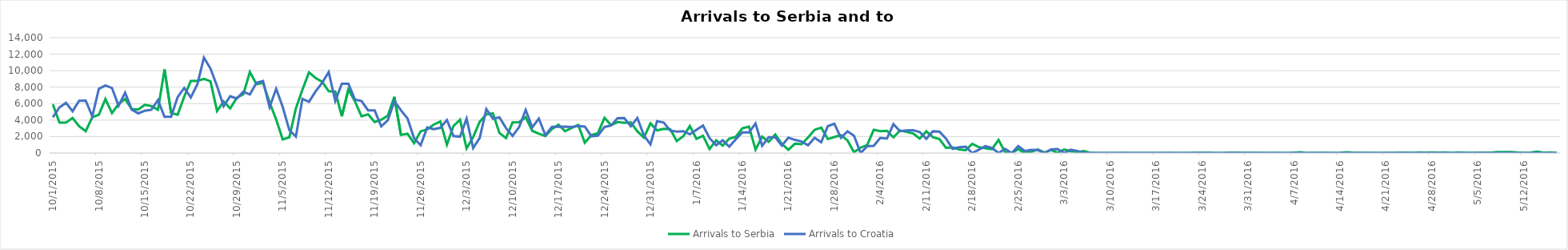
| Category | Arrivals to Serbia | Arrivals to Croatia |
|---|---|---|
| 10/1/15 | 5900 | 4344 |
| 10/2/15 | 3700 | 5546 |
| 10/3/15 | 3700 | 6086 |
| 10/4/15 | 4250 | 5065 |
| 10/5/15 | 3250 | 6338 |
| 10/6/15 | 2650 | 6370 |
| 10/7/15 | 4350 | 4446 |
| 10/8/15 | 4650 | 7798 |
| 10/9/15 | 6550 | 8201 |
| 10/10/15 | 4850 | 7896 |
| 10/11/15 | 5950 | 5732 |
| 10/12/15 | 6556 | 7317 |
| 10/13/15 | 5330 | 5286 |
| 10/14/15 | 5280 | 4814 |
| 10/15/15 | 5850 | 5138 |
| 10/16/15 | 5700 | 5260 |
| 10/17/15 | 5250 | 6415 |
| 10/18/15 | 10150 | 4390 |
| 10/19/15 | 4850 | 4388 |
| 10/20/15 | 4650 | 6793 |
| 10/21/15 | 6850 | 7900 |
| 10/22/15 | 8750 | 6748 |
| 10/23/15 | 8750 | 8348 |
| 10/24/15 | 9000 | 11570 |
| 10/25/15 | 8700 | 10249 |
| 10/26/15 | 5100 | 8128 |
| 10/27/15 | 6257 | 5683 |
| 10/28/15 | 5415 | 6900 |
| 10/29/15 | 6700 | 6615 |
| 10/30/15 | 7138 | 7429 |
| 10/31/15 | 9834 | 7110 |
| 11/1/15 | 8354 | 8534 |
| 11/2/15 | 8521 | 8746 |
| 11/3/15 | 6129 | 5573 |
| 11/4/15 | 4073 | 7792 |
| 11/5/15 | 1652 | 5587 |
| 11/6/15 | 1906 | 2809 |
| 11/7/15 | 5397 | 2000 |
| 11/8/15 | 7695 | 6579 |
| 11/9/15 | 9785 | 6214 |
| 11/10/15 | 9107 | 7474 |
| 11/11/15 | 8648 | 8524 |
| 11/12/15 | 7500 | 9823 |
| 11/13/15 | 7464 | 6314 |
| 11/14/15 | 4453 | 8405 |
| 11/15/15 | 7734 | 8415 |
| 11/16/15 | 6267 | 6490 |
| 11/17/15 | 4460 | 6304 |
| 11/18/15 | 4694 | 5180 |
| 11/19/15 | 3765 | 5167 |
| 11/20/15 | 4042 | 3230 |
| 11/21/15 | 4527 | 3977 |
| 11/22/15 | 6826 | 6305 |
| 11/23/15 | 2201 | 5184 |
| 11/24/15 | 2335 | 4203 |
| 11/25/15 | 1194 | 1808 |
| 11/26/15 | 2636 | 952 |
| 11/27/15 | 2878 | 3095 |
| 11/28/15 | 3454 | 2886 |
| 11/29/15 | 3825 | 3060 |
| 11/30/15 | 1009 | 4009 |
| 12/1/15 | 3284 | 2066 |
| 12/2/15 | 4040 | 1982 |
| 12/3/15 | 553 | 4174 |
| 12/4/15 | 1927 | 611 |
| 12/5/15 | 3799 | 1835 |
| 12/6/15 | 4686 | 5339 |
| 12/7/15 | 4823 | 4162 |
| 12/8/15 | 2437 | 4335 |
| 12/9/15 | 1807 | 3027 |
| 12/10/15 | 3723 | 2076 |
| 12/11/15 | 3747 | 3149 |
| 12/12/15 | 4339 | 5225 |
| 12/13/15 | 2698 | 3112 |
| 12/14/15 | 2353 | 4174 |
| 12/15/15 | 2067 | 2160 |
| 12/16/15 | 2916 | 3177 |
| 12/17/15 | 3438 | 3192 |
| 12/18/15 | 2649 | 3200 |
| 12/19/15 | 3052 | 3156 |
| 12/20/15 | 3405 | 3276 |
| 12/21/15 | 1253 | 3210 |
| 12/22/15 | 2186 | 2027 |
| 12/23/15 | 2415 | 2116 |
| 12/24/15 | 4279 | 3166 |
| 12/25/15 | 3390 | 3339 |
| 12/26/15 | 3757 | 4241 |
| 12/27/15 | 3674 | 4251 |
| 12/28/15 | 3708 | 3249 |
| 12/29/15 | 2629 | 4253 |
| 12/30/15 | 1879 | 2132 |
| 12/31/15 | 3602 | 1058 |
| 1/1/16 | 2745 | 3869 |
| 1/2/16 | 2947 | 3710 |
| 1/3/16 | 2889 | 2732 |
| 1/4/16 | 1462 | 2591 |
| 1/5/16 | 2041 | 2650 |
| 1/6/16 | 3273 | 2273 |
| 1/7/16 | 1715 | 2814 |
| 1/8/16 | 2100 | 3332 |
| 1/9/16 | 489 | 1799 |
| 1/10/16 | 1538 | 942 |
| 1/11/16 | 905 | 1549 |
| 1/12/16 | 1743 | 769 |
| 1/13/16 | 1973 | 1679 |
| 1/14/16 | 3006 | 2502 |
| 1/15/16 | 3213 | 2493 |
| 1/16/16 | 415 | 3579 |
| 1/17/16 | 1995 | 878 |
| 1/18/16 | 1362 | 1930 |
| 1/19/16 | 2244 | 1917 |
| 1/20/16 | 1113 | 914 |
| 1/21/16 | 397 | 1865 |
| 1/22/16 | 1134 | 1599 |
| 1/23/16 | 1064 | 1394 |
| 1/24/16 | 1895 | 946 |
| 1/25/16 | 2827 | 1847 |
| 1/26/16 | 3091 | 1309 |
| 1/27/16 | 1695 | 3256 |
| 1/28/16 | 1940 | 3565 |
| 1/29/16 | 2167 | 1843 |
| 1/30/16 | 1540 | 2641 |
| 1/31/16 | 103 | 2098 |
| 2/1/16 | 660 | 0 |
| 2/2/16 | 966 | 822 |
| 2/3/16 | 2825 | 881 |
| 2/4/16 | 2653 | 1836 |
| 2/5/16 | 2694 | 1750 |
| 2/6/16 | 1901 | 3510 |
| 2/7/16 | 2739 | 2658 |
| 2/8/16 | 2563 | 2736 |
| 2/9/16 | 2379 | 2764 |
| 2/10/16 | 1758 | 2544 |
| 2/11/16 | 2636 | 1716 |
| 2/12/16 | 1923 | 2635 |
| 2/13/16 | 1699 | 2595 |
| 2/14/16 | 641 | 1749 |
| 2/15/16 | 691 | 512 |
| 2/16/16 | 443 | 701 |
| 2/17/16 | 345 | 769 |
| 2/18/16 | 1117 | 0 |
| 2/19/16 | 713 | 408 |
| 2/20/16 | 580 | 834 |
| 2/21/16 | 476 | 630 |
| 2/22/16 | 1595 | 0 |
| 2/23/16 | 106 | 507 |
| 2/24/16 | 1 | 0 |
| 2/25/16 | 475 | 841 |
| 2/26/16 | 0 | 250 |
| 2/27/16 | 158 | 385 |
| 2/28/16 | 431 | 358 |
| 2/29/16 | 69 | 0 |
| 3/1/16 | 372 | 436 |
| 3/2/16 | 16 | 476 |
| 3/3/16 | 428 | 0 |
| 3/4/16 | 218 | 410 |
| 3/5/16 | 115 | 253 |
| 3/6/16 | 236 | 0 |
| 3/7/16 | 14 | 0 |
| 3/8/16 | 0 | 0 |
| 3/9/16 | 3 | 0 |
| 3/10/16 | 0 | 0 |
| 3/11/16 | 0 | 0 |
| 3/12/16 | 35 | 0 |
| 3/13/16 | 12 | 0 |
| 3/14/16 | 0 | 0 |
| 3/15/16 | 0 | 0 |
| 3/16/16 | 0 | 0 |
| 3/17/16 | 0 | 0 |
| 3/18/16 | 0 | 0 |
| 3/19/16 | 30 | 0 |
| 3/20/16 | 0 | 0 |
| 3/21/16 | 0 | 0 |
| 3/22/16 | 0 | 0 |
| 3/23/16 | 49 | 0 |
| 3/24/16 | 31 | 0 |
| 3/25/16 | 40 | 0 |
| 3/26/16 | 0 | 0 |
| 3/27/16 | 4 | 0 |
| 3/28/16 | 42 | 0 |
| 3/29/16 | 37 | 0 |
| 3/30/16 | 21 | 0 |
| 3/31/16 | 14 | 0 |
| 4/1/16 | 28 | 0 |
| 4/2/16 | 32 | 0 |
| 4/3/16 | 10 | 0 |
| 4/4/16 | 28 | 0 |
| 4/5/16 | 0 | 0 |
| 4/6/16 | 4 | 0 |
| 4/7/16 | 58 | 0 |
| 4/8/16 | 93 | 0 |
| 4/9/16 | 8 | 0 |
| 4/10/16 | 30 | 0 |
| 4/11/16 | 34 | 0 |
| 4/12/16 | 22 | 0 |
| 4/13/16 | 3 | 0 |
| 4/14/16 | 34 | 0 |
| 4/15/16 | 90 | 0 |
| 4/16/16 | 41 | 0 |
| 4/17/16 | 15 | 0 |
| 4/18/16 | 17 | 0 |
| 4/19/16 | 34 | 0 |
| 4/20/16 | 5 | 0 |
| 4/21/16 | 31 | 0 |
| 4/22/16 | 19 | 0 |
| 4/23/16 | 45 | 0 |
| 4/24/16 | 38 | 0 |
| 4/25/16 | 34 | 0 |
| 4/26/16 | 73 | 0 |
| 4/27/16 | 54 | 0 |
| 4/28/16 | 69 | 0 |
| 4/29/16 | 59 | 0 |
| 4/30/16 | 80 | 0 |
| 5/1/16 | 26 | 0 |
| 5/2/16 | 81 | 0 |
| 5/3/16 | 50 | 0 |
| 5/4/16 | 25 | 0 |
| 5/5/16 | 58 | 0 |
| 5/6/16 | 49 | 0 |
| 5/7/16 | 59 | 0 |
| 5/8/16 | 128 | 0 |
| 5/9/16 | 113 | 0 |
| 5/10/16 | 119 | 0 |
| 5/11/16 | 62 | 0 |
| 5/12/16 | 33 | 0 |
| 5/13/16 | 51 | 0 |
| 5/14/16 | 161 | 0 |
| 5/15/16 | 45 | 0 |
| 5/16/16 | 71 | 0 |
| 5/17/16 | 17 | 0 |